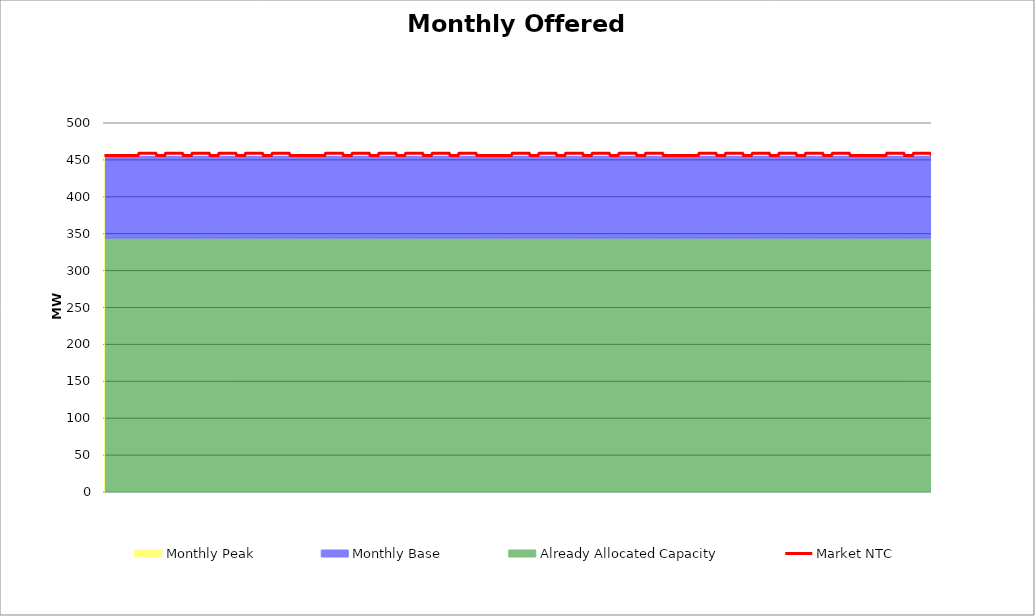
| Category | Market NTC |
|---|---|
| 0 | 456 |
| 1 | 456 |
| 2 | 456 |
| 3 | 456 |
| 4 | 456 |
| 5 | 456 |
| 6 | 456 |
| 7 | 456 |
| 8 | 456 |
| 9 | 456 |
| 10 | 456 |
| 11 | 456 |
| 12 | 456 |
| 13 | 456 |
| 14 | 456 |
| 15 | 456 |
| 16 | 456 |
| 17 | 456 |
| 18 | 456 |
| 19 | 456 |
| 20 | 456 |
| 21 | 456 |
| 22 | 456 |
| 23 | 456 |
| 24 | 456 |
| 25 | 456 |
| 26 | 456 |
| 27 | 456 |
| 28 | 456 |
| 29 | 456 |
| 30 | 456 |
| 31 | 459 |
| 32 | 459 |
| 33 | 459 |
| 34 | 459 |
| 35 | 459 |
| 36 | 459 |
| 37 | 459 |
| 38 | 459 |
| 39 | 459 |
| 40 | 459 |
| 41 | 459 |
| 42 | 459 |
| 43 | 459 |
| 44 | 459 |
| 45 | 459 |
| 46 | 459 |
| 47 | 456 |
| 48 | 456 |
| 49 | 456 |
| 50 | 456 |
| 51 | 456 |
| 52 | 456 |
| 53 | 456 |
| 54 | 456 |
| 55 | 459 |
| 56 | 459 |
| 57 | 459 |
| 58 | 459 |
| 59 | 459 |
| 60 | 459 |
| 61 | 459 |
| 62 | 459 |
| 63 | 459 |
| 64 | 459 |
| 65 | 459 |
| 66 | 459 |
| 67 | 459 |
| 68 | 459 |
| 69 | 459 |
| 70 | 459 |
| 71 | 456 |
| 72 | 456 |
| 73 | 456 |
| 74 | 456 |
| 75 | 456 |
| 76 | 456 |
| 77 | 456 |
| 78 | 456 |
| 79 | 459 |
| 80 | 459 |
| 81 | 459 |
| 82 | 459 |
| 83 | 459 |
| 84 | 459 |
| 85 | 459 |
| 86 | 459 |
| 87 | 459 |
| 88 | 459 |
| 89 | 459 |
| 90 | 459 |
| 91 | 459 |
| 92 | 459 |
| 93 | 459 |
| 94 | 459 |
| 95 | 456 |
| 96 | 456 |
| 97 | 456 |
| 98 | 456 |
| 99 | 456 |
| 100 | 456 |
| 101 | 456 |
| 102 | 456 |
| 103 | 459 |
| 104 | 459 |
| 105 | 459 |
| 106 | 459 |
| 107 | 459 |
| 108 | 459 |
| 109 | 459 |
| 110 | 459 |
| 111 | 459 |
| 112 | 459 |
| 113 | 459 |
| 114 | 459 |
| 115 | 459 |
| 116 | 459 |
| 117 | 459 |
| 118 | 459 |
| 119 | 456 |
| 120 | 456 |
| 121 | 456 |
| 122 | 456 |
| 123 | 456 |
| 124 | 456 |
| 125 | 456 |
| 126 | 456 |
| 127 | 459 |
| 128 | 459 |
| 129 | 459 |
| 130 | 459 |
| 131 | 459 |
| 132 | 459 |
| 133 | 459 |
| 134 | 459 |
| 135 | 459 |
| 136 | 459 |
| 137 | 459 |
| 138 | 459 |
| 139 | 459 |
| 140 | 459 |
| 141 | 459 |
| 142 | 459 |
| 143 | 456 |
| 144 | 456 |
| 145 | 456 |
| 146 | 456 |
| 147 | 456 |
| 148 | 456 |
| 149 | 456 |
| 150 | 456 |
| 151 | 459 |
| 152 | 459 |
| 153 | 459 |
| 154 | 459 |
| 155 | 459 |
| 156 | 459 |
| 157 | 459 |
| 158 | 459 |
| 159 | 459 |
| 160 | 459 |
| 161 | 459 |
| 162 | 459 |
| 163 | 459 |
| 164 | 459 |
| 165 | 459 |
| 166 | 459 |
| 167 | 456 |
| 168 | 456 |
| 169 | 456 |
| 170 | 456 |
| 171 | 456 |
| 172 | 456 |
| 173 | 456 |
| 174 | 456 |
| 175 | 456 |
| 176 | 456 |
| 177 | 456 |
| 178 | 456 |
| 179 | 456 |
| 180 | 456 |
| 181 | 456 |
| 182 | 456 |
| 183 | 456 |
| 184 | 456 |
| 185 | 456 |
| 186 | 456 |
| 187 | 456 |
| 188 | 456 |
| 189 | 456 |
| 190 | 456 |
| 191 | 456 |
| 192 | 456 |
| 193 | 456 |
| 194 | 456 |
| 195 | 456 |
| 196 | 456 |
| 197 | 456 |
| 198 | 456 |
| 199 | 459 |
| 200 | 459 |
| 201 | 459 |
| 202 | 459 |
| 203 | 459 |
| 204 | 459 |
| 205 | 459 |
| 206 | 459 |
| 207 | 459 |
| 208 | 459 |
| 209 | 459 |
| 210 | 459 |
| 211 | 459 |
| 212 | 459 |
| 213 | 459 |
| 214 | 459 |
| 215 | 456 |
| 216 | 456 |
| 217 | 456 |
| 218 | 456 |
| 219 | 456 |
| 220 | 456 |
| 221 | 456 |
| 222 | 456 |
| 223 | 459 |
| 224 | 459 |
| 225 | 459 |
| 226 | 459 |
| 227 | 459 |
| 228 | 459 |
| 229 | 459 |
| 230 | 459 |
| 231 | 459 |
| 232 | 459 |
| 233 | 459 |
| 234 | 459 |
| 235 | 459 |
| 236 | 459 |
| 237 | 459 |
| 238 | 459 |
| 239 | 456 |
| 240 | 456 |
| 241 | 456 |
| 242 | 456 |
| 243 | 456 |
| 244 | 456 |
| 245 | 456 |
| 246 | 456 |
| 247 | 459 |
| 248 | 459 |
| 249 | 459 |
| 250 | 459 |
| 251 | 459 |
| 252 | 459 |
| 253 | 459 |
| 254 | 459 |
| 255 | 459 |
| 256 | 459 |
| 257 | 459 |
| 258 | 459 |
| 259 | 459 |
| 260 | 459 |
| 261 | 459 |
| 262 | 459 |
| 263 | 456 |
| 264 | 456 |
| 265 | 456 |
| 266 | 456 |
| 267 | 456 |
| 268 | 456 |
| 269 | 456 |
| 270 | 456 |
| 271 | 459 |
| 272 | 459 |
| 273 | 459 |
| 274 | 459 |
| 275 | 459 |
| 276 | 459 |
| 277 | 459 |
| 278 | 459 |
| 279 | 459 |
| 280 | 459 |
| 281 | 459 |
| 282 | 459 |
| 283 | 459 |
| 284 | 459 |
| 285 | 459 |
| 286 | 459 |
| 287 | 456 |
| 288 | 456 |
| 289 | 456 |
| 290 | 456 |
| 291 | 456 |
| 292 | 456 |
| 293 | 456 |
| 294 | 456 |
| 295 | 459 |
| 296 | 459 |
| 297 | 459 |
| 298 | 459 |
| 299 | 459 |
| 300 | 459 |
| 301 | 459 |
| 302 | 459 |
| 303 | 459 |
| 304 | 459 |
| 305 | 459 |
| 306 | 459 |
| 307 | 459 |
| 308 | 459 |
| 309 | 459 |
| 310 | 459 |
| 311 | 456 |
| 312 | 456 |
| 313 | 456 |
| 314 | 456 |
| 315 | 456 |
| 316 | 456 |
| 317 | 456 |
| 318 | 456 |
| 319 | 459 |
| 320 | 459 |
| 321 | 459 |
| 322 | 459 |
| 323 | 459 |
| 324 | 459 |
| 325 | 459 |
| 326 | 459 |
| 327 | 459 |
| 328 | 459 |
| 329 | 459 |
| 330 | 459 |
| 331 | 459 |
| 332 | 459 |
| 333 | 459 |
| 334 | 459 |
| 335 | 456 |
| 336 | 456 |
| 337 | 456 |
| 338 | 456 |
| 339 | 456 |
| 340 | 456 |
| 341 | 456 |
| 342 | 456 |
| 343 | 456 |
| 344 | 456 |
| 345 | 456 |
| 346 | 456 |
| 347 | 456 |
| 348 | 456 |
| 349 | 456 |
| 350 | 456 |
| 351 | 456 |
| 352 | 456 |
| 353 | 456 |
| 354 | 456 |
| 355 | 456 |
| 356 | 456 |
| 357 | 456 |
| 358 | 456 |
| 359 | 456 |
| 360 | 456 |
| 361 | 456 |
| 362 | 456 |
| 363 | 456 |
| 364 | 456 |
| 365 | 456 |
| 366 | 456 |
| 367 | 459 |
| 368 | 459 |
| 369 | 459 |
| 370 | 459 |
| 371 | 459 |
| 372 | 459 |
| 373 | 459 |
| 374 | 459 |
| 375 | 459 |
| 376 | 459 |
| 377 | 459 |
| 378 | 459 |
| 379 | 459 |
| 380 | 459 |
| 381 | 459 |
| 382 | 459 |
| 383 | 456 |
| 384 | 456 |
| 385 | 456 |
| 386 | 456 |
| 387 | 456 |
| 388 | 456 |
| 389 | 456 |
| 390 | 456 |
| 391 | 459 |
| 392 | 459 |
| 393 | 459 |
| 394 | 459 |
| 395 | 459 |
| 396 | 459 |
| 397 | 459 |
| 398 | 459 |
| 399 | 459 |
| 400 | 459 |
| 401 | 459 |
| 402 | 459 |
| 403 | 459 |
| 404 | 459 |
| 405 | 459 |
| 406 | 459 |
| 407 | 456 |
| 408 | 456 |
| 409 | 456 |
| 410 | 456 |
| 411 | 456 |
| 412 | 456 |
| 413 | 456 |
| 414 | 456 |
| 415 | 459 |
| 416 | 459 |
| 417 | 459 |
| 418 | 459 |
| 419 | 459 |
| 420 | 459 |
| 421 | 459 |
| 422 | 459 |
| 423 | 459 |
| 424 | 459 |
| 425 | 459 |
| 426 | 459 |
| 427 | 459 |
| 428 | 459 |
| 429 | 459 |
| 430 | 459 |
| 431 | 456 |
| 432 | 456 |
| 433 | 456 |
| 434 | 456 |
| 435 | 456 |
| 436 | 456 |
| 437 | 456 |
| 438 | 456 |
| 439 | 459 |
| 440 | 459 |
| 441 | 459 |
| 442 | 459 |
| 443 | 459 |
| 444 | 459 |
| 445 | 459 |
| 446 | 459 |
| 447 | 459 |
| 448 | 459 |
| 449 | 459 |
| 450 | 459 |
| 451 | 459 |
| 452 | 459 |
| 453 | 459 |
| 454 | 459 |
| 455 | 456 |
| 456 | 456 |
| 457 | 456 |
| 458 | 456 |
| 459 | 456 |
| 460 | 456 |
| 461 | 456 |
| 462 | 456 |
| 463 | 459 |
| 464 | 459 |
| 465 | 459 |
| 466 | 459 |
| 467 | 459 |
| 468 | 459 |
| 469 | 459 |
| 470 | 459 |
| 471 | 459 |
| 472 | 459 |
| 473 | 459 |
| 474 | 459 |
| 475 | 459 |
| 476 | 459 |
| 477 | 459 |
| 478 | 459 |
| 479 | 456 |
| 480 | 456 |
| 481 | 456 |
| 482 | 456 |
| 483 | 456 |
| 484 | 456 |
| 485 | 456 |
| 486 | 456 |
| 487 | 459 |
| 488 | 459 |
| 489 | 459 |
| 490 | 459 |
| 491 | 459 |
| 492 | 459 |
| 493 | 459 |
| 494 | 459 |
| 495 | 459 |
| 496 | 459 |
| 497 | 459 |
| 498 | 459 |
| 499 | 459 |
| 500 | 459 |
| 501 | 459 |
| 502 | 459 |
| 503 | 456 |
| 504 | 456 |
| 505 | 456 |
| 506 | 456 |
| 507 | 456 |
| 508 | 456 |
| 509 | 456 |
| 510 | 456 |
| 511 | 456 |
| 512 | 456 |
| 513 | 456 |
| 514 | 456 |
| 515 | 456 |
| 516 | 456 |
| 517 | 456 |
| 518 | 456 |
| 519 | 456 |
| 520 | 456 |
| 521 | 456 |
| 522 | 456 |
| 523 | 456 |
| 524 | 456 |
| 525 | 456 |
| 526 | 456 |
| 527 | 456 |
| 528 | 456 |
| 529 | 456 |
| 530 | 456 |
| 531 | 456 |
| 532 | 456 |
| 533 | 456 |
| 534 | 456 |
| 535 | 459 |
| 536 | 459 |
| 537 | 459 |
| 538 | 459 |
| 539 | 459 |
| 540 | 459 |
| 541 | 459 |
| 542 | 459 |
| 543 | 459 |
| 544 | 459 |
| 545 | 459 |
| 546 | 459 |
| 547 | 459 |
| 548 | 459 |
| 549 | 459 |
| 550 | 459 |
| 551 | 456 |
| 552 | 456 |
| 553 | 456 |
| 554 | 456 |
| 555 | 456 |
| 556 | 456 |
| 557 | 456 |
| 558 | 456 |
| 559 | 459 |
| 560 | 459 |
| 561 | 459 |
| 562 | 459 |
| 563 | 459 |
| 564 | 459 |
| 565 | 459 |
| 566 | 459 |
| 567 | 459 |
| 568 | 459 |
| 569 | 459 |
| 570 | 459 |
| 571 | 459 |
| 572 | 459 |
| 573 | 459 |
| 574 | 459 |
| 575 | 456 |
| 576 | 456 |
| 577 | 456 |
| 578 | 456 |
| 579 | 456 |
| 580 | 456 |
| 581 | 456 |
| 582 | 456 |
| 583 | 459 |
| 584 | 459 |
| 585 | 459 |
| 586 | 459 |
| 587 | 459 |
| 588 | 459 |
| 589 | 459 |
| 590 | 459 |
| 591 | 459 |
| 592 | 459 |
| 593 | 459 |
| 594 | 459 |
| 595 | 459 |
| 596 | 459 |
| 597 | 459 |
| 598 | 459 |
| 599 | 456 |
| 600 | 456 |
| 601 | 456 |
| 602 | 456 |
| 603 | 456 |
| 604 | 456 |
| 605 | 456 |
| 606 | 456 |
| 607 | 459 |
| 608 | 459 |
| 609 | 459 |
| 610 | 459 |
| 611 | 459 |
| 612 | 459 |
| 613 | 459 |
| 614 | 459 |
| 615 | 459 |
| 616 | 459 |
| 617 | 459 |
| 618 | 459 |
| 619 | 459 |
| 620 | 459 |
| 621 | 459 |
| 622 | 459 |
| 623 | 456 |
| 624 | 456 |
| 625 | 456 |
| 626 | 456 |
| 627 | 456 |
| 628 | 456 |
| 629 | 456 |
| 630 | 456 |
| 631 | 459 |
| 632 | 459 |
| 633 | 459 |
| 634 | 459 |
| 635 | 459 |
| 636 | 459 |
| 637 | 459 |
| 638 | 459 |
| 639 | 459 |
| 640 | 459 |
| 641 | 459 |
| 642 | 459 |
| 643 | 459 |
| 644 | 459 |
| 645 | 459 |
| 646 | 459 |
| 647 | 456 |
| 648 | 456 |
| 649 | 456 |
| 650 | 456 |
| 651 | 456 |
| 652 | 456 |
| 653 | 456 |
| 654 | 456 |
| 655 | 459 |
| 656 | 459 |
| 657 | 459 |
| 658 | 459 |
| 659 | 459 |
| 660 | 459 |
| 661 | 459 |
| 662 | 459 |
| 663 | 459 |
| 664 | 459 |
| 665 | 459 |
| 666 | 459 |
| 667 | 459 |
| 668 | 459 |
| 669 | 459 |
| 670 | 459 |
| 671 | 456 |
| 672 | 456 |
| 673 | 456 |
| 674 | 456 |
| 675 | 456 |
| 676 | 456 |
| 677 | 456 |
| 678 | 456 |
| 679 | 456 |
| 680 | 456 |
| 681 | 456 |
| 682 | 456 |
| 683 | 456 |
| 684 | 456 |
| 685 | 456 |
| 686 | 456 |
| 687 | 456 |
| 688 | 456 |
| 689 | 456 |
| 690 | 456 |
| 691 | 456 |
| 692 | 456 |
| 693 | 456 |
| 694 | 456 |
| 695 | 456 |
| 696 | 456 |
| 697 | 456 |
| 698 | 456 |
| 699 | 456 |
| 700 | 456 |
| 701 | 456 |
| 702 | 456 |
| 703 | 456 |
| 704 | 459 |
| 705 | 459 |
| 706 | 459 |
| 707 | 459 |
| 708 | 459 |
| 709 | 459 |
| 710 | 459 |
| 711 | 459 |
| 712 | 459 |
| 713 | 459 |
| 714 | 459 |
| 715 | 459 |
| 716 | 459 |
| 717 | 459 |
| 718 | 459 |
| 719 | 459 |
| 720 | 456 |
| 721 | 456 |
| 722 | 456 |
| 723 | 456 |
| 724 | 456 |
| 725 | 456 |
| 726 | 456 |
| 727 | 456 |
| 728 | 459 |
| 729 | 459 |
| 730 | 459 |
| 731 | 459 |
| 732 | 459 |
| 733 | 459 |
| 734 | 459 |
| 735 | 459 |
| 736 | 459 |
| 737 | 459 |
| 738 | 459 |
| 739 | 459 |
| 740 | 459 |
| 741 | 459 |
| 742 | 459 |
| 743 | 459 |
| 744 | 456 |